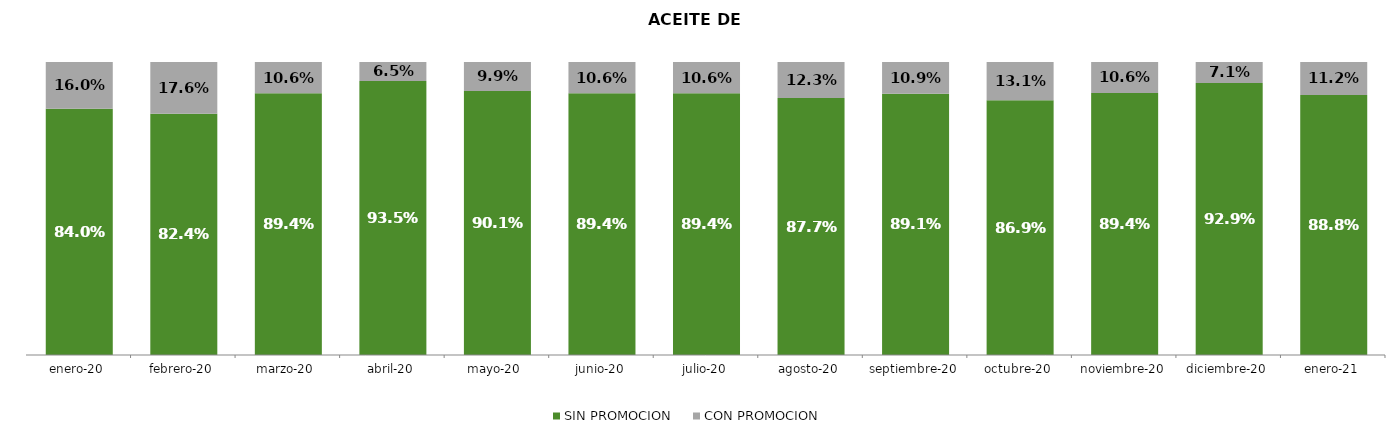
| Category | SIN PROMOCION   | CON PROMOCION   |
|---|---|---|
| 2020-01-01 | 0.84 | 0.16 |
| 2020-02-01 | 0.824 | 0.176 |
| 2020-03-01 | 0.894 | 0.106 |
| 2020-04-01 | 0.935 | 0.065 |
| 2020-05-01 | 0.901 | 0.099 |
| 2020-06-01 | 0.894 | 0.106 |
| 2020-07-01 | 0.894 | 0.106 |
| 2020-08-01 | 0.877 | 0.123 |
| 2020-09-01 | 0.891 | 0.109 |
| 2020-10-01 | 0.869 | 0.131 |
| 2020-11-01 | 0.894 | 0.106 |
| 2020-12-01 | 0.929 | 0.071 |
| 2021-01-01 | 0.888 | 0.112 |